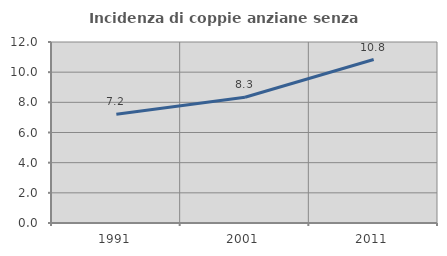
| Category | Incidenza di coppie anziane senza figli  |
|---|---|
| 1991.0 | 7.203 |
| 2001.0 | 8.336 |
| 2011.0 | 10.836 |